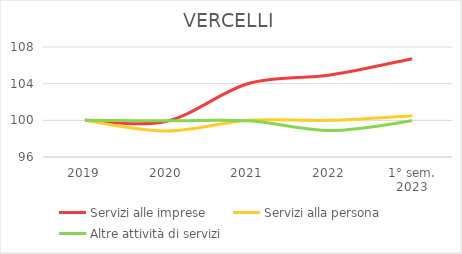
| Category | Servizi alle imprese | Servizi alla persona | Altre attività di servizi |
|---|---|---|---|
| 2019 | 100 | 100 | 100 |
| 2020 | 99.907 | 98.84 | 99.944 |
| 2021 | 104.011 | 100 | 99.944 |
| 2022 | 104.944 | 100 | 98.883 |
| 1° sem.
2023 | 106.716 | 100.497 | 99.944 |